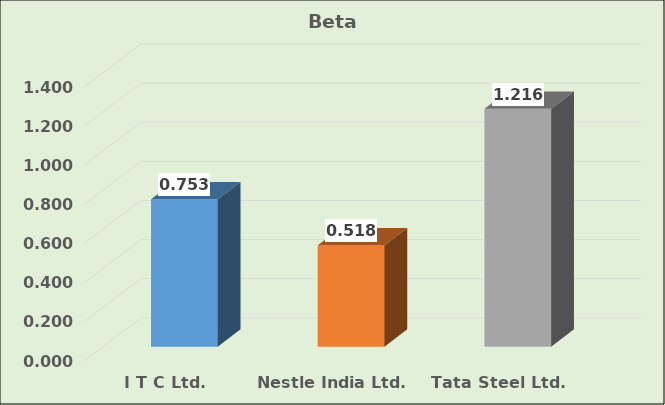
| Category | Beta |
|---|---|
| I T C Ltd. | 0.753 |
| Nestle India Ltd. | 0.518 |
| Tata Steel Ltd. | 1.216 |